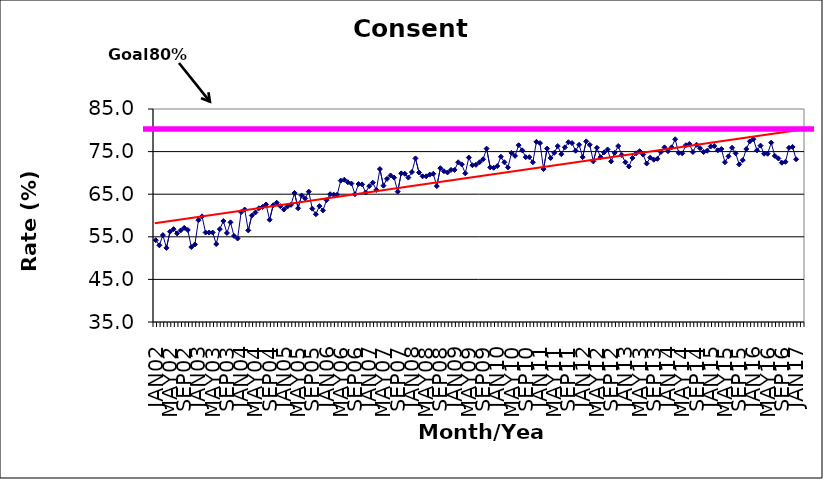
| Category | Series 0 |
|---|---|
| JAN02 | 54.2 |
| FEB02 | 53 |
| MAR02 | 55.4 |
| APR02 | 52.4 |
| MAY02 | 56.2 |
| JUN02 | 56.8 |
| JUL02 | 55.8 |
| AUG02 | 56.5 |
| SEP02 | 57.1 |
| OCT02 | 56.6 |
| NOV02 | 52.6 |
| DEC02 | 53.2 |
| JAN03 | 58.9 |
| FEB03 | 59.8 |
| MAR03 | 56 |
| APR03 | 56 |
| MAY03 | 56 |
| JUN03 | 53.3 |
| JUL03 | 56.8 |
| AUG03 | 58.7 |
| SEP03 | 55.9 |
| OCT03 | 58.4 |
| NOV03 | 55.2 |
| DEC03 | 54.6 |
| JAN04 | 60.8 |
| FEB04 | 61.4 |
| MAR04 | 56.5 |
| APR04 | 60 |
| MAY04 | 60.7 |
| JUN04 | 61.7 |
| JUL04 | 62 |
| AUG04 | 62.6 |
| SEP04 | 59 |
| OCT04 | 62.4 |
| NOV04 | 63 |
| DEC04 | 62.2 |
| JAN05 | 61.4 |
| FEB05 | 62.1 |
| MAR05 | 62.5 |
| APR05 | 65.3 |
| MAY05 | 61.7 |
| JUN05 | 64.7 |
| JUL05 | 64 |
| AUG05 | 65.6 |
| SEP05 | 61.6 |
| OCT05 | 60.3 |
| NOV05 | 62.2 |
| DEC05 | 61.2 |
| JAN06 | 63.6 |
| FEB06 | 65 |
| MAR06 | 64.9 |
| APR06 | 64.9 |
| MAY06 | 68.2 |
| JUN06 | 68.4 |
| JUL06 | 67.8 |
| AUG06 | 67.5 |
| SEP06 | 65 |
| OCT06 | 67.4 |
| NOV06 | 67.3 |
| DEC06 | 65.4 |
| JAN07 | 66.9 |
| FEB07 | 67.7 |
| MAR07 | 66 |
| APR07 | 70.9 |
| MAY07 | 67 |
| JUN07 | 68.6 |
| JUL07 | 69.4 |
| AUG07 | 68.9 |
| SEP07 | 65.6 |
| OCT07 | 69.9 |
| NOV07 | 69.8 |
| DEC07 | 68.9 |
| JAN08 | 70.2 |
| FEB08 | 73.4 |
| MAR08 | 70.1 |
| APR08 | 69.2 |
| MAY08 | 69.2 |
| JUN08 | 69.6 |
| JUL08 | 69.8 |
| AUG08 | 66.9 |
| SEP08 | 71.1 |
| OCT08 | 70.4 |
| NOV08 | 70.1 |
| DEC08 | 70.7 |
| JAN09 | 70.7 |
| FEB09 | 72.5 |
| MAR09 | 72 |
| APR09 | 69.9 |
| MAY09 | 73.6 |
| JUN09 | 71.8 |
| JUL09 | 71.9 |
| AUG09 | 72.5 |
| SEP09 | 73.2 |
| OCT09 | 75.7 |
| NOV09 | 71.3 |
| DEC09 | 71.2 |
| JAN10 | 71.6 |
| FEB10 | 73.8 |
| MAR10 | 72.5 |
| APR10 | 71.3 |
| MAY10 | 74.7 |
| JUN10 | 74 |
| JUL10 | 76.5 |
| AUG10 | 75.3 |
| SEP10 | 73.7 |
| OCT10 | 73.7 |
| NOV10 | 72.5 |
| DEC10 | 77.3 |
| JAN11 | 77 |
| FEB11 | 70.9 |
| MAR11 | 75.7 |
| APR11 | 73.5 |
| MAY11 | 74.7 |
| JUN11 | 76.3 |
| JUL11 | 74.4 |
| AUG11 | 76 |
| SEP11 | 77.2 |
| OCT11 | 77 |
| NOV11 | 75.2 |
| DEC11 | 76.6 |
| JAN12 | 73.7 |
| FEB12 | 77.4 |
| MAR12 | 76.6 |
| APR12 | 72.7 |
| MAY12 | 75.9 |
| JUN12 | 73.7 |
| JUL12 | 74.8 |
| AUG12 | 75.5 |
| SEP12 | 72.7 |
| OCT12 | 74.7 |
| NOV12 | 76.3 |
| DEC12 | 74.2 |
| JAN13 | 72.5 |
| FEB13 | 71.5 |
| MAR13 | 73.5 |
| APR13 | 74.6 |
| MAY13 | 75.1 |
| JUN13 | 74.3 |
| JUL13 | 72.2 |
| AUG13 | 73.6 |
| SEP13 | 73.1 |
| OCT13 | 73.3 |
| NOV13 | 74.9 |
| DEC13 | 76 |
| JAN14 | 75.1 |
| FEB14 | 76 |
| MAR14 | 77.9 |
| APR14 | 74.7 |
| MAY14 | 74.6 |
| JUN14 | 76.5 |
| JUL14 | 76.8 |
| AUG14 | 74.9 |
| SEP14 | 76.6 |
| OCT14 | 75.8 |
| NOV14 | 74.9 |
| DEC14 | 75.2 |
| JAN15 | 76.2 |
| FEB15 | 76.3 |
| MAR15 | 75.3 |
| APR15 | 75.6 |
| MAY15 | 72.5 |
| JUN15 | 73.9 |
| JUL15 | 75.9 |
| AUG15 | 74.6 |
| SEP15 | 72 |
| OCT15 | 73 |
| NOV15 | 75.6 |
| DEC15 | 77.4 |
| JAN16 | 77.9 |
| FEB16 | 75.3 |
| MAR16 | 76.4 |
| APR16 | 74.5 |
| MAY16 | 74.5 |
| JUN16 | 77.1 |
| JUL16 | 74 |
| AUG16 | 73.4 |
| SEP16 | 72.4 |
| OCT16 | 72.6 |
| NOV16 | 75.9 |
| DEC16 | 76.1 |
| JAN17 | 73.2 |